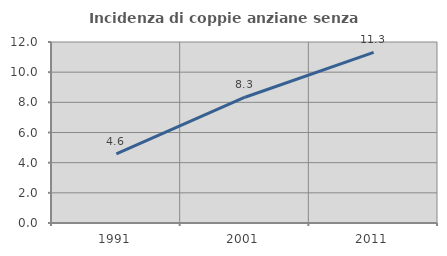
| Category | Incidenza di coppie anziane senza figli  |
|---|---|
| 1991.0 | 4.586 |
| 2001.0 | 8.339 |
| 2011.0 | 11.316 |